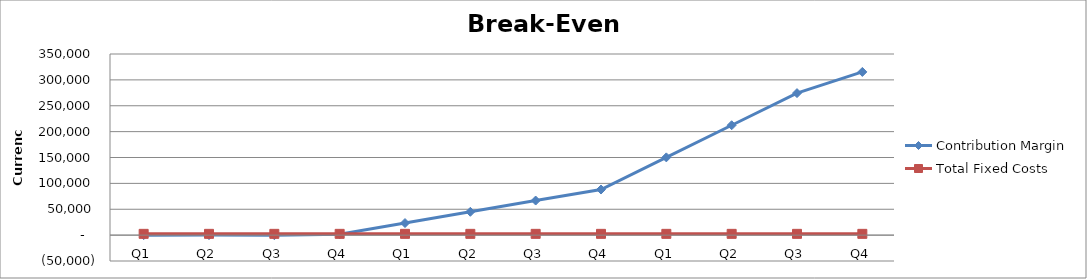
| Category | Contribution Margin | Total Fixed Costs |
|---|---|---|
| Q1 | 0 | 2475 |
| Q2 | 75 | 2475 |
| Q3 | -175 | 2475 |
| Q4 | 1575 | 2475 |
| Q1 | 23325 | 2475 |
| Q2 | 45075 | 2475 |
| Q3 | 66825 | 2475 |
| Q4 | 88125 | 2475 |
| Q1 | 150225 | 2475 |
| Q2 | 212325 | 2475 |
| Q3 | 274425 | 2475 |
| Q4 | 315375 | 2475 |